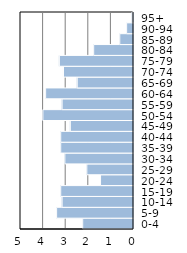
| Category | Series 0 |
|---|---|
| 0-4 | 2.248 |
| 5-9 | 3.402 |
| 10-14 | 3.159 |
| 15-19 | 3.22 |
| 20-24 | 1.458 |
| 25-29 | 2.066 |
| 30-34 | 3.038 |
| 35-39 | 3.22 |
| 40-44 | 3.22 |
| 45-49 | 2.795 |
| 50-54 | 4.01 |
| 55-59 | 3.159 |
| 60-64 | 3.888 |
| 65-69 | 2.491 |
| 70-74 | 3.098 |
| 75-79 | 3.281 |
| 80-84 | 1.762 |
| 85-89 | 0.608 |
| 90-94 | 0.304 |
| 95+ | 0.061 |